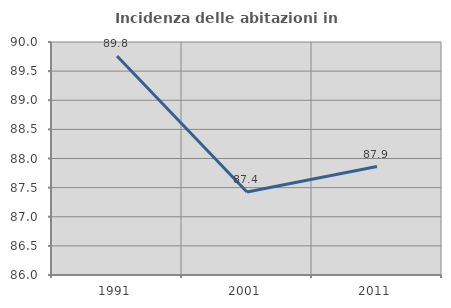
| Category | Incidenza delle abitazioni in proprietà  |
|---|---|
| 1991.0 | 89.759 |
| 2001.0 | 87.425 |
| 2011.0 | 87.861 |